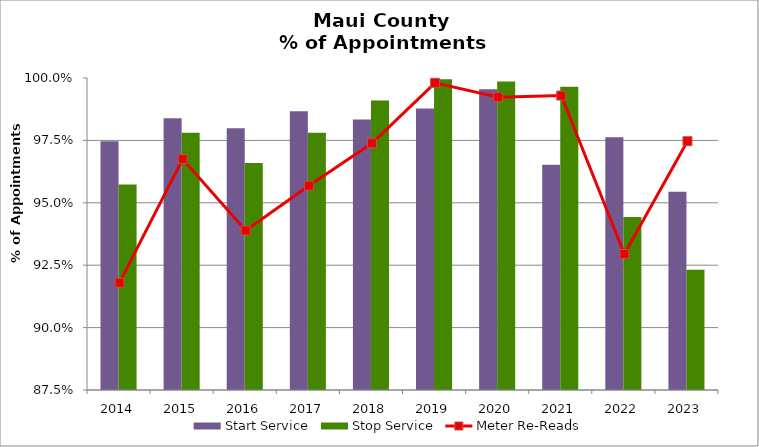
| Category | Start Service | Stop Service |
|---|---|---|
| 2014 | 0.975 | 0.957 |
| 2015 | 0.984 | 0.978 |
| 2016 | 0.98 | 0.966 |
| 2017 | 0.987 | 0.978 |
| 2018 | 0.983 | 0.991 |
| 2019 | 0.988 | 0.999 |
| 2020 | 0.995 | 0.999 |
| 2021 | 0.965 | 0.996 |
| 2022 | 0.976 | 0.944 |
| 2023 | 0.954 | 0.923 |